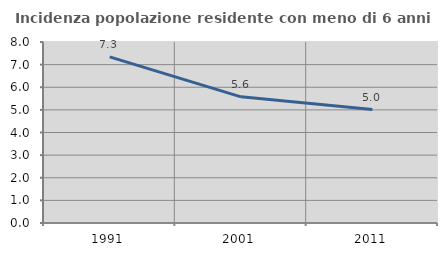
| Category | Incidenza popolazione residente con meno di 6 anni |
|---|---|
| 1991.0 | 7.345 |
| 2001.0 | 5.577 |
| 2011.0 | 5.015 |